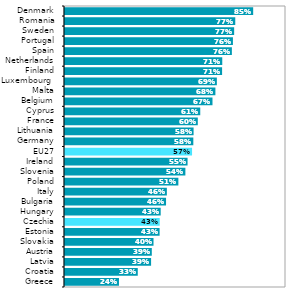
| Category | Series 1 |
|---|---|
| Greece | 0.244 |
| Croatia | 0.329 |
| Latvia | 0.39 |
| Austria | 0.393 |
| Slovakia | 0.401 |
| Estonia | 0.428 |
| Czechia | 0.429 |
| Hungary | 0.433 |
| Bulgaria | 0.457 |
| Italy | 0.461 |
| Poland | 0.513 |
| Slovenia | 0.545 |
| Ireland | 0.555 |
| EU27 | 0.575 |
| Germany | 0.581 |
| Lithuania | 0.582 |
| France | 0.601 |
| Cyprus | 0.612 |
| Belgium | 0.667 |
| Malta | 0.681 |
| Luxembourg  | 0.687 |
| Finland | 0.711 |
| Netherlands | 0.712 |
| Spain | 0.755 |
| Portugal | 0.76 |
| Sweden | 0.765 |
| Romania | 0.77 |
| Denmark | 0.851 |